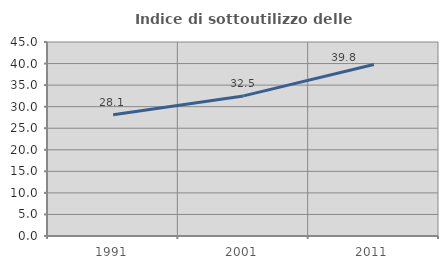
| Category | Indice di sottoutilizzo delle abitazioni  |
|---|---|
| 1991.0 | 28.138 |
| 2001.0 | 32.495 |
| 2011.0 | 39.773 |